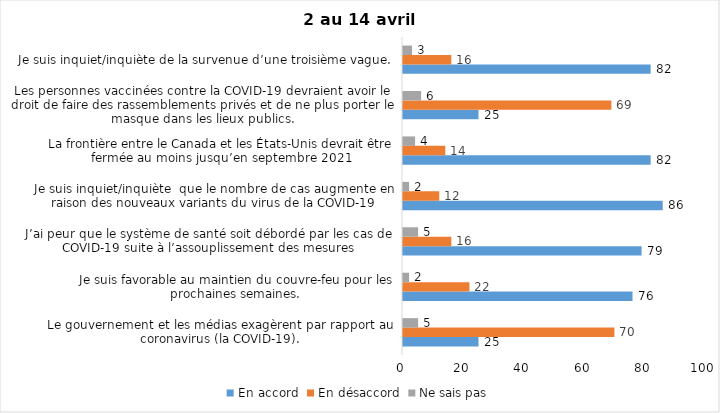
| Category | En accord | En désaccord | Ne sais pas |
|---|---|---|---|
| Le gouvernement et les médias exagèrent par rapport au coronavirus (la COVID-19). | 25 | 70 | 5 |
| Je suis favorable au maintien du couvre-feu pour les prochaines semaines. | 76 | 22 | 2 |
| J’ai peur que le système de santé soit débordé par les cas de COVID-19 suite à l’assouplissement des mesures | 79 | 16 | 5 |
| Je suis inquiet/inquiète  que le nombre de cas augmente en raison des nouveaux variants du virus de la COVID-19 | 86 | 12 | 2 |
| La frontière entre le Canada et les États-Unis devrait être fermée au moins jusqu’en septembre 2021 | 82 | 14 | 4 |
| Les personnes vaccinées contre la COVID-19 devraient avoir le droit de faire des rassemblements privés et de ne plus porter le masque dans les lieux publics. | 25 | 69 | 6 |
| Je suis inquiet/inquiète de la survenue d’une troisième vague. | 82 | 16 | 3 |